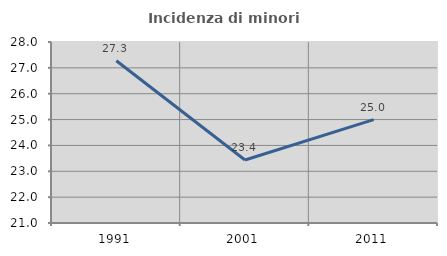
| Category | Incidenza di minori stranieri |
|---|---|
| 1991.0 | 27.273 |
| 2001.0 | 23.438 |
| 2011.0 | 25 |